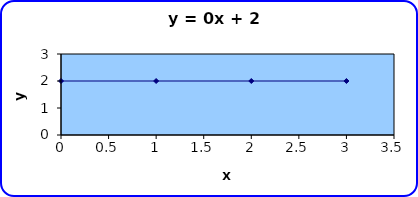
| Category | Series 0 |
|---|---|
| 0.0 | 2 |
| 1.0 | 2 |
| 2.0 | 2 |
| 3.0 | 2 |